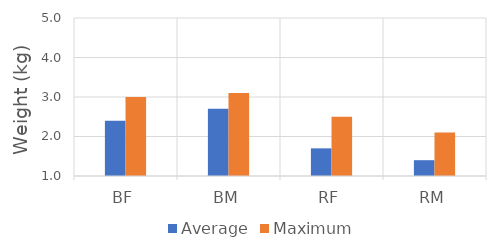
| Category | Average | Maximum |
|---|---|---|
| BF | 2.4 | 3 |
| BM | 2.7 | 3.1 |
| RF | 1.7 | 2.5 |
| RM | 1.4 | 2.1 |